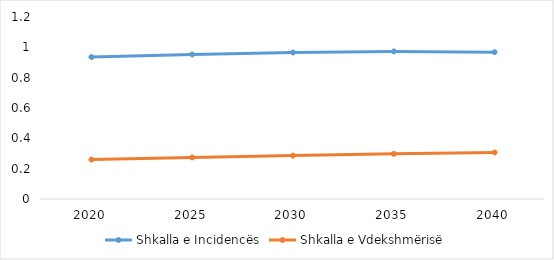
| Category | Shkalla e Incidencës | Shkalla e Vdekshmërisë |
|---|---|---|
| 2020.0 | 0.936 | 0.26 |
| 2025.0 | 0.953 | 0.274 |
| 2030.0 | 0.966 | 0.286 |
| 2035.0 | 0.973 | 0.298 |
| 2040.0 | 0.968 | 0.307 |